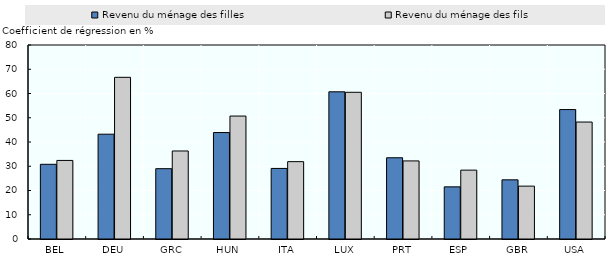
| Category | Revenu du ménage des filles | Revenu du ménage des fils |
|---|---|---|
| BEL | 30.8 | 32.4 |
| DEU | 43.216 | 66.674 |
| GRC | 29 | 36.3 |
| HUN | 43.9 | 50.7 |
| ITA | 29.1 | 31.9 |
| LUX | 60.7 | 60.5 |
| PRT | 33.5 | 32.2 |
| ESP | 21.5 | 28.4 |
| GBR | 24.4 | 21.8 |
| USA | 53.37 | 48.228 |